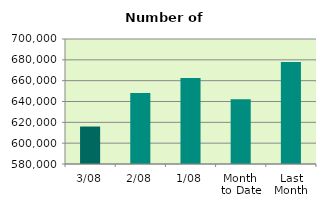
| Category | Series 0 |
|---|---|
| 3/08 | 615988 |
| 2/08 | 648046 |
| 1/08 | 662450 |
| Month 
to Date | 642161.333 |
| Last
Month | 677996.667 |